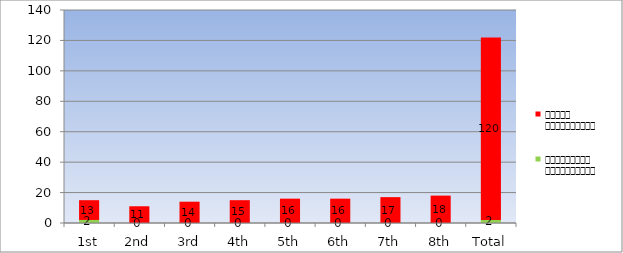
| Category | लाभान्वित विद्यार्थी | वंचित विद्यार्थी |
|---|---|---|
| 1st | 2 | 13 |
| 2nd | 0 | 11 |
| 3rd | 0 | 14 |
| 4th | 0 | 15 |
| 5th | 0 | 16 |
| 6th | 0 | 16 |
| 7th | 0 | 17 |
| 8th | 0 | 18 |
| Total | 2 | 120 |